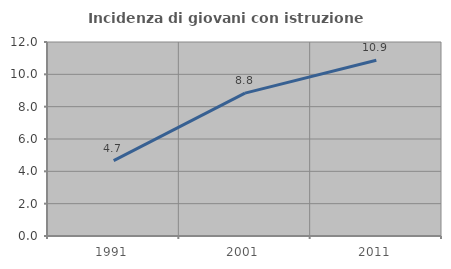
| Category | Incidenza di giovani con istruzione universitaria |
|---|---|
| 1991.0 | 4.667 |
| 2001.0 | 8.835 |
| 2011.0 | 10.87 |